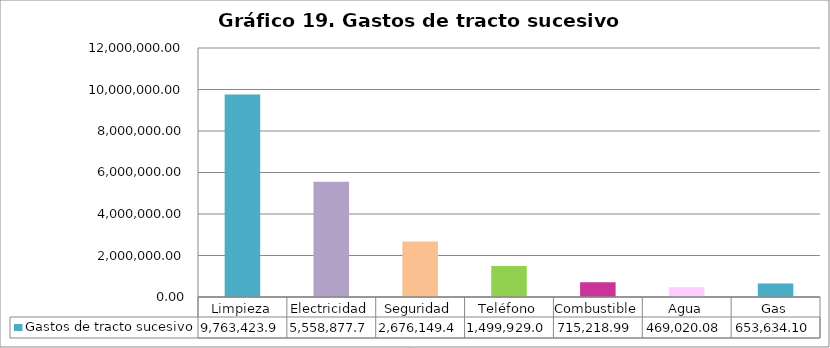
| Category | Gastos de tracto sucesivo |
|---|---|
| Limpieza | 9763423.91 |
| Electricidad | 5558877.72 |
| Seguridad | 2676149.46 |
| Teléfono | 1499929.02 |
| Combustible | 715218.99 |
| Agua | 469020.08 |
| Gas | 653634.1 |